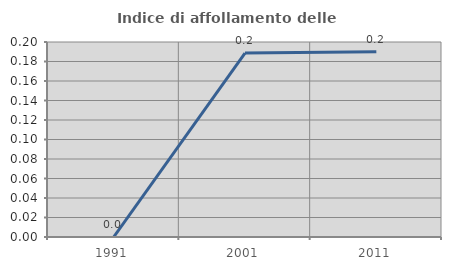
| Category | Indice di affollamento delle abitazioni  |
|---|---|
| 1991.0 | 0 |
| 2001.0 | 0.189 |
| 2011.0 | 0.19 |